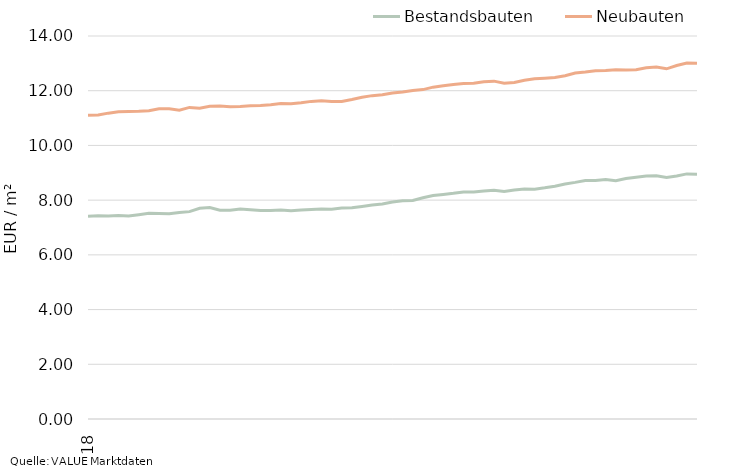
| Category | Bestandsbauten | Neubauten |
|---|---|---|
| 2018-04-30 | 7.41 | 11.1 |
| 2018-05-31 | 7.43 | 11.11 |
| 2018-06-30 | 7.42 | 11.18 |
| 2018-07-31 | 7.44 | 11.23 |
| 2018-08-31 | 7.42 | 11.24 |
| 2018-09-30 | 7.47 | 11.25 |
| 2018-10-31 | 7.52 | 11.27 |
| 2018-11-30 | 7.51 | 11.34 |
| 2018-12-31 | 7.5 | 11.34 |
| 2019-01-31 | 7.55 | 11.29 |
| 2019-02-28 | 7.58 | 11.39 |
| 2019-03-31 | 7.7 | 11.36 |
| 2019-04-30 | 7.73 | 11.43 |
| 2019-05-31 | 7.63 | 11.44 |
| 2019-06-30 | 7.63 | 11.41 |
| 2019-07-31 | 7.68 | 11.42 |
| 2019-08-31 | 7.65 | 11.45 |
| 2019-09-30 | 7.62 | 11.46 |
| 2019-10-31 | 7.62 | 11.49 |
| 2019-11-30 | 7.64 | 11.53 |
| 2019-12-31 | 7.61 | 11.52 |
| 2020-01-31 | 7.64 | 11.56 |
| 2020-02-29 | 7.66 | 11.61 |
| 2020-03-31 | 7.68 | 11.63 |
| 2020-04-30 | 7.67 | 11.61 |
| 2020-05-31 | 7.71 | 11.61 |
| 2020-06-30 | 7.72 | 11.68 |
| 2020-07-31 | 7.77 | 11.76 |
| 2020-08-31 | 7.82 | 11.82 |
| 2020-09-30 | 7.86 | 11.85 |
| 2020-10-31 | 7.93 | 11.92 |
| 2020-11-30 | 7.98 | 11.95 |
| 2020-12-31 | 7.99 | 12.01 |
| 2021-01-31 | 8.09 | 12.04 |
| 2021-02-28 | 8.17 | 12.13 |
| 2021-03-31 | 8.21 | 12.18 |
| 2021-04-30 | 8.25 | 12.23 |
| 2021-05-31 | 8.3 | 12.26 |
| 2021-06-30 | 8.3 | 12.27 |
| 2021-07-31 | 8.33 | 12.33 |
| 2021-08-31 | 8.36 | 12.35 |
| 2021-09-30 | 8.32 | 12.27 |
| 2021-10-31 | 8.37 | 12.3 |
| 2021-11-30 | 8.41 | 12.38 |
| 2021-12-31 | 8.4 | 12.44 |
| 2022-01-31 | 8.45 | 12.46 |
| 2022-02-28 | 8.51 | 12.48 |
| 2022-03-31 | 8.59 | 12.55 |
| 2022-04-30 | 8.65 | 12.65 |
| 2022-05-31 | 8.72 | 12.68 |
| 2022-06-30 | 8.72 | 12.73 |
| 2022-07-31 | 8.75 | 12.74 |
| 2022-08-31 | 8.71 | 12.77 |
| 2022-09-30 | 8.79 | 12.76 |
| 2022-10-31 | 8.84 | 12.77 |
| 2022-11-30 | 8.88 | 12.84 |
| 2022-12-31 | 8.89 | 12.87 |
| 2023-01-31 | 8.83 | 12.8 |
| 2023-02-28 | 8.88 | 12.92 |
| 2023-03-31 | 8.96 | 13.01 |
| 2023-04-30 | 8.95 | 13 |